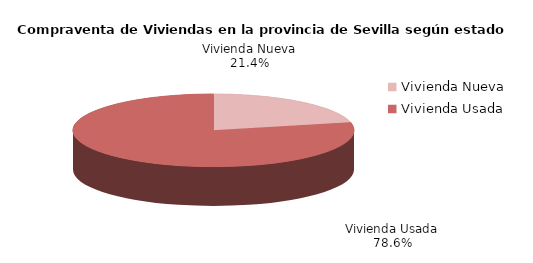
| Category | Series 0 | Series 1 |
|---|---|---|
| Vivienda Nueva | 388 | 0.214 |
| Vivienda Usada | 1425 | 0.786 |